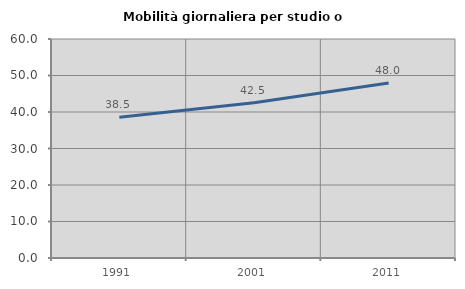
| Category | Mobilità giornaliera per studio o lavoro |
|---|---|
| 1991.0 | 38.539 |
| 2001.0 | 42.516 |
| 2011.0 | 47.951 |